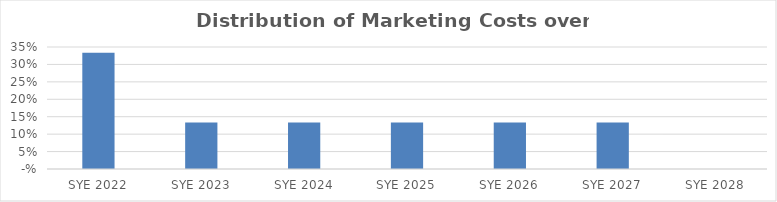
| Category | Series 0 |
|---|---|
| 2022.0 | 0.333 |
| 2023.0 | 0.133 |
| 2024.0 | 0.133 |
| 2025.0 | 0.133 |
| 2026.0 | 0.133 |
| 2027.0 | 0.133 |
| 2028.0 | 0 |